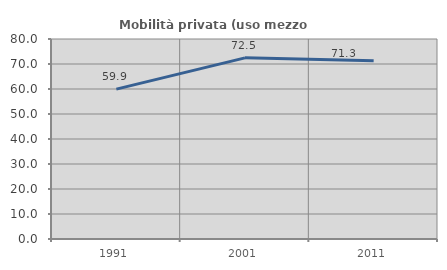
| Category | Mobilità privata (uso mezzo privato) |
|---|---|
| 1991.0 | 59.944 |
| 2001.0 | 72.451 |
| 2011.0 | 71.319 |